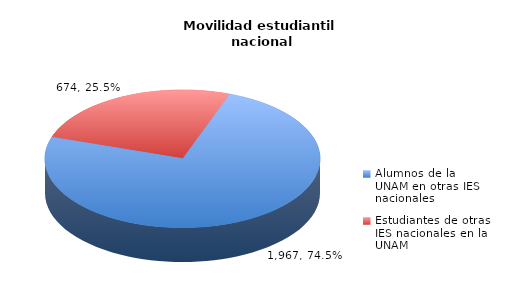
| Category | Series 0 |
|---|---|
| Alumnos de la UNAM en otras IES nacionales | 1967 |
| Estudiantes de otras IES nacionales en la UNAM | 674 |